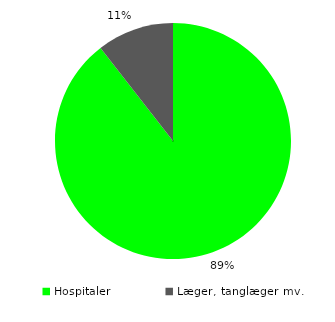
| Category | Series 0 |
|---|---|
| Hospitaler | 0.895 |
| Læger, tanglæger mv. | 0.105 |